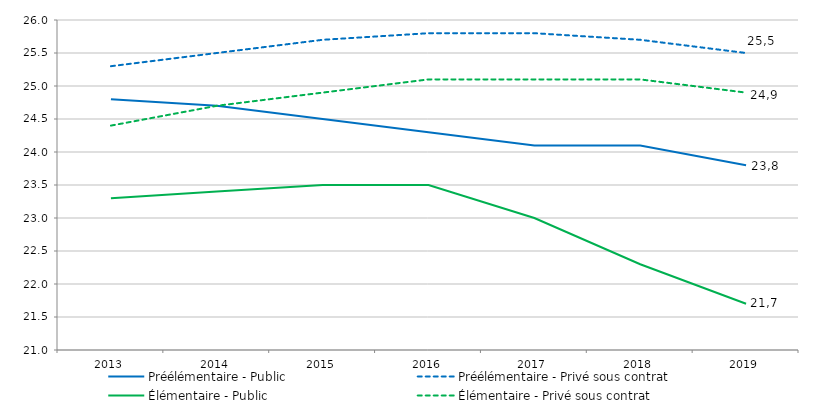
| Category | Préélémentaire - Public | Préélémentaire - Privé sous contrat | Élémentaire - Public | Élémentaire - Privé sous contrat |
|---|---|---|---|---|
| 2013.0 | 24.8 | 25.3 | 23.3 | 24.4 |
| 2014.0 | 24.7 | 25.5 | 23.4 | 24.7 |
| 2015.0 | 24.5 | 25.7 | 23.5 | 24.9 |
| 2016.0 | 24.3 | 25.8 | 23.5 | 25.1 |
| 2017.0 | 24.1 | 25.8 | 23 | 25.1 |
| 2018.0 | 24.1 | 25.7 | 22.3 | 25.1 |
| 2019.0 | 23.8 | 25.5 | 21.7 | 24.9 |